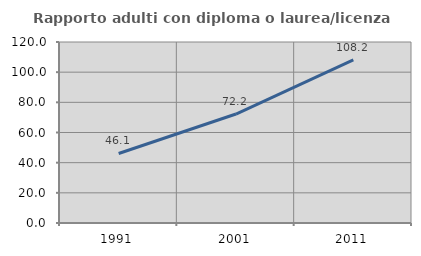
| Category | Rapporto adulti con diploma o laurea/licenza media  |
|---|---|
| 1991.0 | 46.108 |
| 2001.0 | 72.249 |
| 2011.0 | 108.163 |